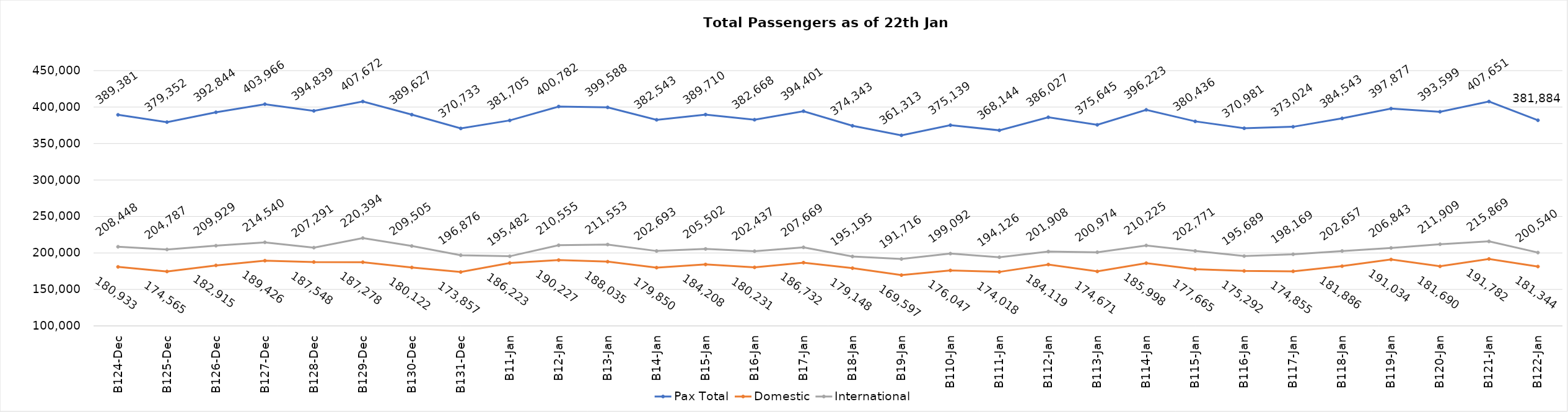
| Category | Pax Total | Domestic | International |
|---|---|---|---|
| 2023-12-24 | 389381 | 180933 | 208448 |
| 2023-12-25 | 379352 | 174565 | 204787 |
| 2023-12-26 | 392844 | 182915 | 209929 |
| 2023-12-27 | 403966 | 189426 | 214540 |
| 2023-12-28 | 394839 | 187548 | 207291 |
| 2023-12-29 | 407672 | 187278 | 220394 |
| 2023-12-30 | 389627 | 180122 | 209505 |
| 2023-12-31 | 370733 | 173857 | 196876 |
| 2024-01-01 | 381705 | 186223 | 195482 |
| 2024-01-02 | 400782 | 190227 | 210555 |
| 2024-01-03 | 399588 | 188035 | 211553 |
| 2024-01-04 | 382543 | 179850 | 202693 |
| 2024-01-05 | 389710 | 184208 | 205502 |
| 2024-01-06 | 382668 | 180231 | 202437 |
| 2024-01-07 | 394401 | 186732 | 207669 |
| 2024-01-08 | 374343 | 179148 | 195195 |
| 2024-01-09 | 361313 | 169597 | 191716 |
| 2024-01-10 | 375139 | 176047 | 199092 |
| 2024-01-11 | 368144 | 174018 | 194126 |
| 2024-01-12 | 386027 | 184119 | 201908 |
| 2024-01-13 | 375645 | 174671 | 200974 |
| 2024-01-14 | 396223 | 185998 | 210225 |
| 2024-01-15 | 380436 | 177665 | 202771 |
| 2024-01-16 | 370981 | 175292 | 195689 |
| 2024-01-17 | 373024 | 174855 | 198169 |
| 2024-01-18 | 384543 | 181886 | 202657 |
| 2024-01-19 | 397877 | 191034 | 206843 |
| 2024-01-20 | 393599 | 181690 | 211909 |
| 2024-01-21 | 407651 | 191782 | 215869 |
| 2024-01-22 | 381884 | 181344 | 200540 |